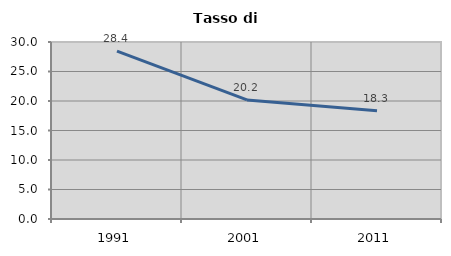
| Category | Tasso di disoccupazione   |
|---|---|
| 1991.0 | 28.44 |
| 2001.0 | 20.183 |
| 2011.0 | 18.348 |